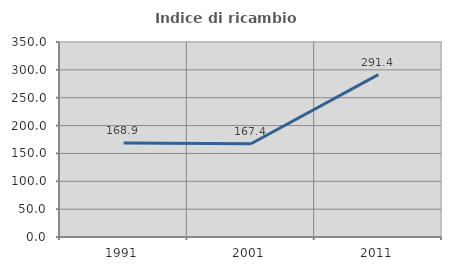
| Category | Indice di ricambio occupazionale  |
|---|---|
| 1991.0 | 168.91 |
| 2001.0 | 167.405 |
| 2011.0 | 291.373 |